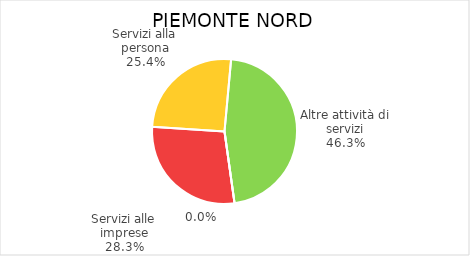
| Category | Piemonte Nord |
|---|---|
| Servizi alle imprese | 6691 |
| Servizi alla persona | 6016 |
| Altre attività di servizi | 10966 |